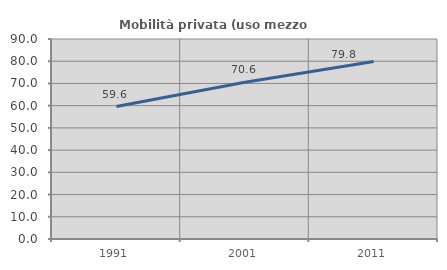
| Category | Mobilità privata (uso mezzo privato) |
|---|---|
| 1991.0 | 59.585 |
| 2001.0 | 70.582 |
| 2011.0 | 79.836 |